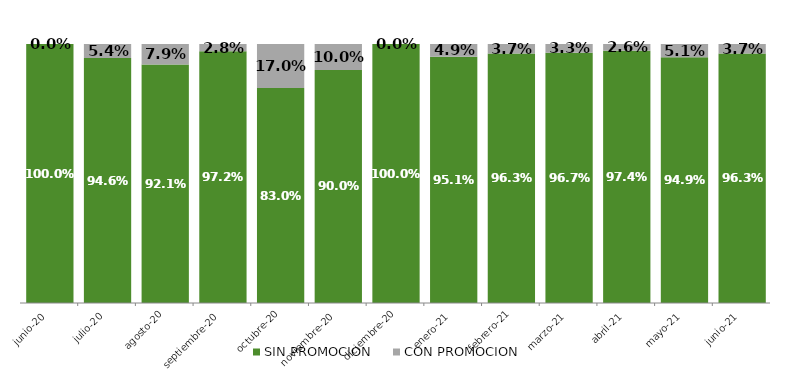
| Category | SIN PROMOCION   | CON PROMOCION   |
|---|---|---|
| 2020-06-01 | 1 | 0 |
| 2020-07-01 | 0.946 | 0.054 |
| 2020-08-01 | 0.921 | 0.079 |
| 2020-09-01 | 0.972 | 0.028 |
| 2020-10-01 | 0.83 | 0.17 |
| 2020-11-01 | 0.9 | 0.1 |
| 2020-12-01 | 1 | 0 |
| 2021-01-01 | 0.951 | 0.049 |
| 2021-02-01 | 0.963 | 0.037 |
| 2021-03-01 | 0.967 | 0.033 |
| 2021-04-01 | 0.974 | 0.026 |
| 2021-05-01 | 0.949 | 0.051 |
| 2021-06-01 | 0.963 | 0.037 |